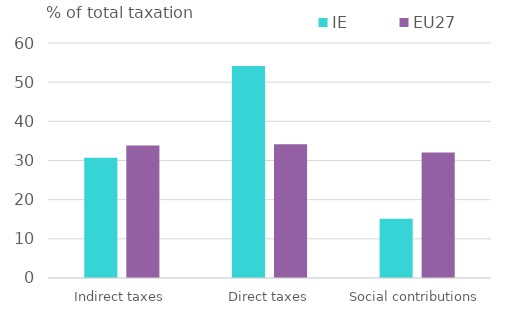
| Category | IE | EU27 |
|---|---|---|
| Indirect taxes | 30.727 | 33.811 |
| Direct taxes | 54.123 | 34.133 |
| Social contributions | 15.151 | 32.056 |